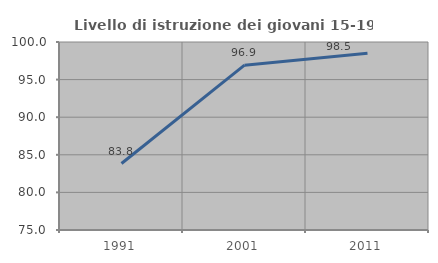
| Category | Livello di istruzione dei giovani 15-19 anni |
|---|---|
| 1991.0 | 83.843 |
| 2001.0 | 96.923 |
| 2011.0 | 98.507 |